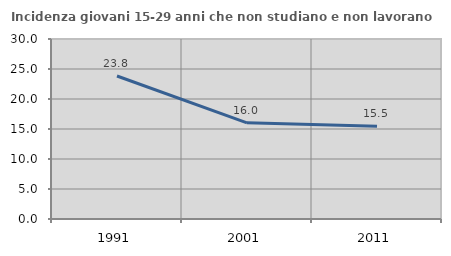
| Category | Incidenza giovani 15-29 anni che non studiano e non lavorano  |
|---|---|
| 1991.0 | 23.838 |
| 2001.0 | 16.031 |
| 2011.0 | 15.464 |